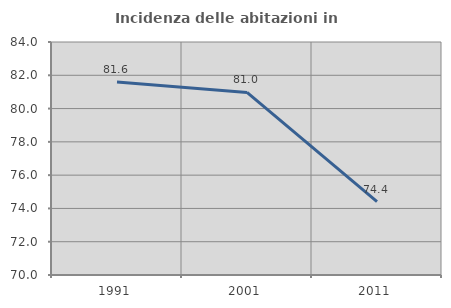
| Category | Incidenza delle abitazioni in proprietà  |
|---|---|
| 1991.0 | 81.594 |
| 2001.0 | 80.971 |
| 2011.0 | 74.412 |